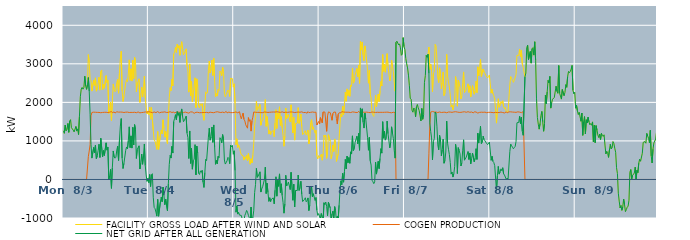
| Category | FACILITY GROSS LOAD AFTER WIND AND SOLAR | COGEN PRODUCTION | NET GRID AFTER ALL GENERATION |
|---|---|---|---|
|  Mon  8/3 | 1263 | 0 | 1263 |
|  Mon  8/3 | 1198 | 0 | 1198 |
|  Mon  8/3 | 1409 | 0 | 1409 |
|  Mon  8/3 | 1263 | 0 | 1263 |
|  Mon  8/3 | 1294 | 0 | 1294 |
|  Mon  8/3 | 1453 | 0 | 1453 |
|  Mon  8/3 | 1223 | 0 | 1223 |
|  Mon  8/3 | 1514 | 0 | 1514 |
|  Mon  8/3 | 1551 | 0 | 1551 |
|  Mon  8/3 | 1341 | 0 | 1341 |
|  Mon  8/3 | 1343 | 0 | 1343 |
|  Mon  8/3 | 1281 | 0 | 1281 |
|  Mon  8/3 | 1233 | 0 | 1233 |
|  Mon  8/3 | 1221 | 0 | 1221 |
|  Mon  8/3 | 1374 | 0 | 1374 |
|  Mon  8/3 | 1255 | 0 | 1255 |
|  Mon  8/3 | 1313 | 0 | 1313 |
|  Mon  8/3 | 1165 | 0 | 1165 |
|  Mon  8/3 | 1635 | 0 | 1635 |
|  Mon  8/3 | 2145 | 0 | 2145 |
|  Mon  8/3 | 2344 | 0 | 2344 |
|  Mon  8/3 | 2387 | 0 | 2387 |
|  Mon  8/3 | 2342 | 0 | 2342 |
|  Mon  8/3 | 2389 | 0 | 2389 |
|  Mon  8/3 | 2678 | 0 | 2678 |
|  Mon  8/3 | 2427 | 0 | 2427 |
|  Mon  8/3 | 2337 | 0 | 2337 |
|  Mon  8/3 | 2453 | 0 | 2453 |
|  Mon  8/3 | 3239 | 594 | 2645 |
|  Mon  8/3 | 3032 | 739 | 2293 |
|  Mon  8/3 | 2593 | 903 | 1690 |
|  Mon  8/3 | 2563 | 1652 | 911 |
|  Mon  8/3 | 2292 | 1738 | 554 |
|  Mon  8/3 | 2301 | 1746 | 555 |
|  Mon  8/3 | 2576 | 1746 | 830 |
|  Mon  8/3 | 2442 | 1756 | 686 |
|  Mon  8/3 | 2636 | 1743 | 893 |
|  Mon  8/3 | 2290 | 1748 | 542 |
|  Mon  8/3 | 2350 | 1740 | 610 |
|  Mon  8/3 | 2495 | 1747 | 748 |
|  Mon  8/3 | 2653 | 1739 | 914 |
|  Mon  8/3 | 2318 | 1748 | 570 |
|  Mon  8/3 | 2799 | 1731 | 1068 |
|  Mon  8/3 | 2841 | 1750 | 1091 |
|  Mon  8/3 | 2325 | 1739 | 586 |
|  Mon  8/3 | 2474 | 1723 | 751 |
|  Mon  8/3 | 2363 | 1742 | 621 |
|  Mon  8/3 | 2384 | 1741 | 643 |
|  Mon  8/3 | 2693 | 1743 | 950 |
|  Mon  8/3 | 2514 | 1754 | 760 |
|  Mon  8/3 | 2571 | 1736 | 835 |
|  Mon  8/3 | 1715 | 1728 | -13 |
|  Mon  8/3 | 1835 | 1745 | 90 |
|  Mon  8/3 | 2007 | 1746 | 261 |
|  Mon  8/3 | 1531 | 1762 | -231 |
|  Mon  8/3 | 2036 | 1731 | 305 |
|  Mon  8/3 | 2477 | 1738 | 739 |
|  Mon  8/3 | 2335 | 1753 | 582 |
|  Mon  8/3 | 2274 | 1723 | 551 |
|  Mon  8/3 | 2306 | 1729 | 577 |
|  Mon  8/3 | 2518 | 1756 | 762 |
|  Mon  8/3 | 2594 | 1731 | 863 |
|  Mon  8/3 | 2238 | 1746 | 492 |
|  Mon  8/3 | 2768 | 1747 | 1021 |
|  Mon  8/3 | 3132 | 1748 | 1384 |
|  Mon  8/3 | 3326 | 1747 | 1579 |
|  Mon  8/3 | 2298 | 1746 | 552 |
|  Mon  8/3 | 2024 | 1740 | 284 |
|  Mon  8/3 | 2154 | 1737 | 417 |
|  Mon  8/3 | 2334 | 1752 | 582 |
|  Mon  8/3 | 2500 | 1745 | 755 |
|  Mon  8/3 | 2589 | 1746 | 843 |
|  Mon  8/3 | 2538 | 1747 | 791 |
|  Mon  8/3 | 2739 | 1726 | 1013 |
|  Mon  8/3 | 3102 | 1737 | 1365 |
|  Mon  8/3 | 2573 | 1747 | 826 |
|  Mon  8/3 | 2870 | 1740 | 1130 |
|  Mon  8/3 | 2553 | 1739 | 814 |
|  Mon  8/3 | 3091 | 1739 | 1352 |
|  Mon  8/3 | 2617 | 1722 | 895 |
|  Mon  8/3 | 3167 | 1743 | 1424 |
|  Mon  8/3 | 3061 | 1753 | 1308 |
|  Mon  8/3 | 2277 | 1732 | 545 |
|  Mon  8/3 | 2511 | 1731 | 780 |
|  Mon  8/3 | 2545 | 1751 | 794 |
|  Mon  8/3 | 2611 | 1738 | 873 |
|  Mon  8/3 | 2000 | 1728 | 272 |
|  Mon  8/3 | 2168 | 1745 | 423 |
|  Mon  8/3 | 2396 | 1736 | 660 |
|  Mon  8/3 | 2139 | 1745 | 394 |
|  Mon  8/3 | 2350 | 1741 | 609 |
|  Mon  8/3 | 2678 | 1758 | 920 |
|  Mon  8/3 | 2111 | 1751 | 360 |
|  Mon  8/3 | 1874 | 1757 | 117 |
|  Mon  8/3 | 1698 | 1747 | -49 |
|  Mon  8/3 | 1777 | 1750 | 27 |
|  Tue  8/4 | 1676 | 1758 | -82 |
|  Tue  8/4 | 1878 | 1749 | 129 |
|  Tue  8/4 | 1564 | 1747 | -183 |
|  Tue  8/4 | 1865 | 1743 | 122 |
|  Tue  8/4 | 1880 | 1731 | 149 |
|  Tue  8/4 | 1274 | 1735 | -461 |
|  Tue  8/4 | 1027 | 1752 | -725 |
|  Tue  8/4 | 991 | 1749 | -758 |
|  Tue  8/4 | 889 | 1735 | -846 |
|  Tue  8/4 | 781 | 1732 | -951 |
|  Tue  8/4 | 1243 | 1759 | -516 |
|  Tue  8/4 | 781 | 1735 | -954 |
|  Tue  8/4 | 800 | 1730 | -930 |
|  Tue  8/4 | 1154 | 1740 | -586 |
|  Tue  8/4 | 1284 | 1744 | -460 |
|  Tue  8/4 | 1183 | 1761 | -578 |
|  Tue  8/4 | 1548 | 1746 | -198 |
|  Tue  8/4 | 1328 | 1745 | -417 |
|  Tue  8/4 | 1096 | 1753 | -657 |
|  Tue  8/4 | 1245 | 1755 | -510 |
|  Tue  8/4 | 1249 | 1737 | -488 |
|  Tue  8/4 | 926 | 1739 | -813 |
|  Tue  8/4 | 1633 | 1742 | -109 |
|  Tue  8/4 | 2122 | 1731 | 391 |
|  Tue  8/4 | 2380 | 1757 | 623 |
|  Tue  8/4 | 2306 | 1751 | 555 |
|  Tue  8/4 | 2595 | 1737 | 858 |
|  Tue  8/4 | 2428 | 1743 | 685 |
|  Tue  8/4 | 3254 | 1751 | 1503 |
|  Tue  8/4 | 3308 | 1724 | 1584 |
|  Tue  8/4 | 3426 | 1746 | 1680 |
|  Tue  8/4 | 3296 | 1747 | 1549 |
|  Tue  8/4 | 3509 | 1750 | 1759 |
|  Tue  8/4 | 3411 | 1748 | 1663 |
|  Tue  8/4 | 3474 | 1739 | 1735 |
|  Tue  8/4 | 3222 | 1741 | 1481 |
|  Tue  8/4 | 3458 | 1739 | 1719 |
|  Tue  8/4 | 3574 | 1744 | 1830 |
|  Tue  8/4 | 3372 | 1746 | 1626 |
|  Tue  8/4 | 3233 | 1735 | 1498 |
|  Tue  8/4 | 3279 | 1750 | 1529 |
|  Tue  8/4 | 3267 | 1748 | 1519 |
|  Tue  8/4 | 3388 | 1746 | 1642 |
|  Tue  8/4 | 2933 | 1733 | 1200 |
|  Tue  8/4 | 2805 | 1719 | 1086 |
|  Tue  8/4 | 2265 | 1721 | 544 |
|  Tue  8/4 | 2998 | 1740 | 1258 |
|  Tue  8/4 | 2169 | 1752 | 417 |
|  Tue  8/4 | 2551 | 1742 | 809 |
|  Tue  8/4 | 2017 | 1750 | 267 |
|  Tue  8/4 | 2238 | 1739 | 499 |
|  Tue  8/4 | 2242 | 1717 | 525 |
|  Tue  8/4 | 2638 | 1736 | 902 |
|  Tue  8/4 | 1862 | 1743 | 119 |
|  Tue  8/4 | 2610 | 1744 | 866 |
|  Tue  8/4 | 2425 | 1742 | 683 |
|  Tue  8/4 | 1898 | 1743 | 155 |
|  Tue  8/4 | 1860 | 1731 | 129 |
|  Tue  8/4 | 1963 | 1739 | 224 |
|  Tue  8/4 | 1918 | 1733 | 185 |
|  Tue  8/4 | 1967 | 1731 | 236 |
|  Tue  8/4 | 1665 | 1736 | -71 |
|  Tue  8/4 | 1535 | 1742 | -207 |
|  Tue  8/4 | 1915 | 1737 | 178 |
|  Tue  8/4 | 2274 | 1751 | 523 |
|  Tue  8/4 | 2228 | 1740 | 488 |
|  Tue  8/4 | 2254 | 1741 | 513 |
|  Tue  8/4 | 2828 | 1730 | 1098 |
|  Tue  8/4 | 3073 | 1744 | 1329 |
|  Tue  8/4 | 2764 | 1745 | 1019 |
|  Tue  8/4 | 2857 | 1755 | 1102 |
|  Tue  8/4 | 3098 | 1737 | 1361 |
|  Tue  8/4 | 2698 | 1735 | 963 |
|  Tue  8/4 | 3146 | 1732 | 1414 |
|  Tue  8/4 | 2578 | 1734 | 844 |
|  Tue  8/4 | 2140 | 1747 | 393 |
|  Tue  8/4 | 2228 | 1734 | 494 |
|  Tue  8/4 | 2163 | 1756 | 407 |
|  Tue  8/4 | 2334 | 1731 | 603 |
|  Tue  8/4 | 2308 | 1745 | 563 |
|  Tue  8/4 | 2812 | 1729 | 1083 |
|  Tue  8/4 | 2778 | 1737 | 1041 |
|  Tue  8/4 | 2688 | 1741 | 947 |
|  Tue  8/4 | 2910 | 1746 | 1164 |
|  Tue  8/4 | 2805 | 1751 | 1054 |
|  Tue  8/4 | 2238 | 1734 | 504 |
|  Tue  8/4 | 2142 | 1743 | 399 |
|  Tue  8/4 | 2201 | 1764 | 437 |
|  Tue  8/4 | 2213 | 1727 | 486 |
|  Tue  8/4 | 2319 | 1747 | 572 |
|  Tue  8/4 | 2291 | 1746 | 545 |
|  Tue  8/4 | 2153 | 1743 | 410 |
|  Tue  8/4 | 2624 | 1734 | 890 |
|  Tue  8/4 | 2601 | 1755 | 846 |
|  Tue  8/4 | 2617 | 1733 | 884 |
|  Tue  8/4 | 2396 | 1741 | 655 |
|  Wed  8/5 | 2481 | 1738 | 743 |
|  Wed  8/5 | 1969 | 1737 | 232 |
|  Wed  8/5 | 902 | 1752 | -850 |
|  Wed  8/5 | 1055 | 1746 | -691 |
|  Wed  8/5 | 830 | 1729 | -899 |
|  Wed  8/5 | 898 | 1750 | -852 |
|  Wed  8/5 | 832 | 1757 | -925 |
|  Wed  8/5 | 718 | 1654 | -936 |
|  Wed  8/5 | 639 | 1572 | -933 |
|  Wed  8/5 | 625 | 1646 | -1021 |
|  Wed  8/5 | 619 | 1720 | -1101 |
|  Wed  8/5 | 502 | 1561 | -1059 |
|  Wed  8/5 | 587 | 1518 | -931 |
|  Wed  8/5 | 543 | 1418 | -875 |
|  Wed  8/5 | 626 | 1429 | -803 |
|  Wed  8/5 | 480 | 1330 | -850 |
|  Wed  8/5 | 675 | 1605 | -930 |
|  Wed  8/5 | 515 | 1510 | -995 |
|  Wed  8/5 | 395 | 1549 | -1154 |
|  Wed  8/5 | 538 | 1254 | -716 |
|  Wed  8/5 | 428 | 1521 | -1093 |
|  Wed  8/5 | 627 | 1614 | -987 |
|  Wed  8/5 | 937 | 1751 | -814 |
|  Wed  8/5 | 1402 | 1742 | -340 |
|  Wed  8/5 | 1607 | 1742 | -135 |
|  Wed  8/5 | 2032 | 1746 | 286 |
|  Wed  8/5 | 1794 | 1740 | 54 |
|  Wed  8/5 | 1837 | 1748 | 89 |
|  Wed  8/5 | 1814 | 1741 | 73 |
|  Wed  8/5 | 1949 | 1751 | 198 |
|  Wed  8/5 | 1406 | 1733 | -327 |
|  Wed  8/5 | 1505 | 1746 | -241 |
|  Wed  8/5 | 1544 | 1734 | -190 |
|  Wed  8/5 | 1559 | 1744 | -185 |
|  Wed  8/5 | 1750 | 1750 | 0 |
|  Wed  8/5 | 2072 | 1753 | 319 |
|  Wed  8/5 | 1379 | 1745 | -366 |
|  Wed  8/5 | 1632 | 1728 | -96 |
|  Wed  8/5 | 1401 | 1739 | -338 |
|  Wed  8/5 | 1177 | 1746 | -569 |
|  Wed  8/5 | 1269 | 1743 | -474 |
|  Wed  8/5 | 1168 | 1743 | -575 |
|  Wed  8/5 | 1238 | 1747 | -509 |
|  Wed  8/5 | 1218 | 1728 | -510 |
|  Wed  8/5 | 1272 | 1750 | -478 |
|  Wed  8/5 | 1112 | 1745 | -633 |
|  Wed  8/5 | 1470 | 1748 | -278 |
|  Wed  8/5 | 1811 | 1742 | 69 |
|  Wed  8/5 | 1322 | 1756 | -434 |
|  Wed  8/5 | 1722 | 1743 | -21 |
|  Wed  8/5 | 1569 | 1748 | -179 |
|  Wed  8/5 | 1883 | 1739 | 144 |
|  Wed  8/5 | 1400 | 1740 | -340 |
|  Wed  8/5 | 1630 | 1743 | -113 |
|  Wed  8/5 | 1338 | 1754 | -416 |
|  Wed  8/5 | 1140 | 1743 | -603 |
|  Wed  8/5 | 862 | 1737 | -875 |
|  Wed  8/5 | 1125 | 1761 | -636 |
|  Wed  8/5 | 1853 | 1745 | 108 |
|  Wed  8/5 | 1580 | 1751 | -171 |
|  Wed  8/5 | 1605 | 1741 | -136 |
|  Wed  8/5 | 1686 | 1753 | -67 |
|  Wed  8/5 | 1662 | 1748 | -86 |
|  Wed  8/5 | 1493 | 1756 | -263 |
|  Wed  8/5 | 1936 | 1751 | 185 |
|  Wed  8/5 | 1924 | 1735 | 189 |
|  Wed  8/5 | 1208 | 1747 | -539 |
|  Wed  8/5 | 1616 | 1739 | -123 |
|  Wed  8/5 | 1021 | 1736 | -715 |
|  Wed  8/5 | 1445 | 1730 | -285 |
|  Wed  8/5 | 1443 | 1742 | -299 |
|  Wed  8/5 | 1462 | 1751 | -289 |
|  Wed  8/5 | 1863 | 1749 | 114 |
|  Wed  8/5 | 1455 | 1739 | -284 |
|  Wed  8/5 | 1533 | 1744 | -211 |
|  Wed  8/5 | 1697 | 1743 | -46 |
|  Wed  8/5 | 1375 | 1754 | -379 |
|  Wed  8/5 | 1163 | 1737 | -574 |
|  Wed  8/5 | 1184 | 1735 | -551 |
|  Wed  8/5 | 1217 | 1737 | -520 |
|  Wed  8/5 | 1264 | 1739 | -475 |
|  Wed  8/5 | 1151 | 1730 | -579 |
|  Wed  8/5 | 1174 | 1720 | -546 |
|  Wed  8/5 | 1281 | 1760 | -479 |
|  Wed  8/5 | 927 | 1734 | -807 |
|  Wed  8/5 | 1072 | 1739 | -667 |
|  Wed  8/5 | 1476 | 1741 | -265 |
|  Wed  8/5 | 1552 | 1742 | -190 |
|  Wed  8/5 | 1298 | 1750 | -452 |
|  Wed  8/5 | 1364 | 1733 | -369 |
|  Wed  8/5 | 1378 | 1742 | -364 |
|  Wed  8/5 | 1199 | 1746 | -547 |
|  Wed  8/5 | 1276 | 1744 | -468 |
|  Wed  8/5 | 616 | 1413 | -797 |
|  Wed  8/5 | 532 | 1464 | -932 |
|  Wed  8/5 | 620 | 1505 | -885 |
|  Thu  8/6 | 563 | 1438 | -875 |
|  Thu  8/6 | 574 | 1604 | -1030 |
|  Thu  8/6 | 654 | 1539 | -885 |
|  Thu  8/6 | 499 | 1468 | -969 |
|  Thu  8/6 | 661 | 1751 | -1090 |
|  Thu  8/6 | 1148 | 1753 | -605 |
|  Thu  8/6 | 1098 | 1749 | -651 |
|  Thu  8/6 | 1150 | 1735 | -585 |
|  Thu  8/6 | 550 | 1249 | -699 |
|  Thu  8/6 | 708 | 1651 | -943 |
|  Thu  8/6 | 1161 | 1752 | -591 |
|  Thu  8/6 | 1155 | 1742 | -587 |
|  Thu  8/6 | 994 | 1734 | -740 |
|  Thu  8/6 | 538 | 1647 | -1109 |
|  Thu  8/6 | 639 | 1536 | -897 |
|  Thu  8/6 | 890 | 1711 | -821 |
|  Thu  8/6 | 725 | 1746 | -1021 |
|  Thu  8/6 | 1050 | 1755 | -705 |
|  Thu  8/6 | 940 | 1748 | -808 |
|  Thu  8/6 | 469 | 1583 | -1114 |
|  Thu  8/6 | 488 | 1438 | -950 |
|  Thu  8/6 | 665 | 1691 | -1026 |
|  Thu  8/6 | 1060 | 1729 | -669 |
|  Thu  8/6 | 1443 | 1729 | -286 |
|  Thu  8/6 | 1693 | 1728 | -35 |
|  Thu  8/6 | 1625 | 1759 | -134 |
|  Thu  8/6 | 1896 | 1738 | 158 |
|  Thu  8/6 | 1678 | 1749 | -71 |
|  Thu  8/6 | 1939 | 1741 | 198 |
|  Thu  8/6 | 2266 | 1745 | 521 |
|  Thu  8/6 | 2029 | 1756 | 273 |
|  Thu  8/6 | 2349 | 1744 | 605 |
|  Thu  8/6 | 2177 | 1743 | 434 |
|  Thu  8/6 | 2312 | 1744 | 568 |
|  Thu  8/6 | 2157 | 1737 | 420 |
|  Thu  8/6 | 2452 | 1736 | 716 |
|  Thu  8/6 | 2412 | 1753 | 659 |
|  Thu  8/6 | 2883 | 1752 | 1131 |
|  Thu  8/6 | 2497 | 1750 | 747 |
|  Thu  8/6 | 2532 | 1747 | 785 |
|  Thu  8/6 | 2705 | 1743 | 962 |
|  Thu  8/6 | 2716 | 1738 | 978 |
|  Thu  8/6 | 2879 | 1757 | 1122 |
|  Thu  8/6 | 2665 | 1739 | 926 |
|  Thu  8/6 | 2964 | 1768 | 1196 |
|  Thu  8/6 | 2493 | 1736 | 757 |
|  Thu  8/6 | 3583 | 1728 | 1855 |
|  Thu  8/6 | 3356 | 1739 | 1617 |
|  Thu  8/6 | 3567 | 1734 | 1833 |
|  Thu  8/6 | 3230 | 1745 | 1485 |
|  Thu  8/6 | 3081 | 1748 | 1333 |
|  Thu  8/6 | 3465 | 1743 | 1722 |
|  Thu  8/6 | 3318 | 1752 | 1566 |
|  Thu  8/6 | 3332 | 1747 | 1585 |
|  Thu  8/6 | 2832 | 1739 | 1093 |
|  Thu  8/6 | 2497 | 1739 | 758 |
|  Thu  8/6 | 2835 | 1744 | 1091 |
|  Thu  8/6 | 2219 | 1734 | 485 |
|  Thu  8/6 | 2109 | 1736 | 373 |
|  Thu  8/6 | 1731 | 1750 | -19 |
|  Thu  8/6 | 1675 | 1734 | -59 |
|  Thu  8/6 | 1635 | 1744 | -109 |
|  Thu  8/6 | 1660 | 1722 | -62 |
|  Thu  8/6 | 2189 | 1738 | 451 |
|  Thu  8/6 | 1880 | 1741 | 139 |
|  Thu  8/6 | 1867 | 1743 | 124 |
|  Thu  8/6 | 2211 | 1742 | 469 |
|  Thu  8/6 | 2021 | 1740 | 281 |
|  Thu  8/6 | 2295 | 1750 | 545 |
|  Thu  8/6 | 2542 | 1742 | 800 |
|  Thu  8/6 | 2424 | 1741 | 683 |
|  Thu  8/6 | 3239 | 1741 | 1498 |
|  Thu  8/6 | 2807 | 1736 | 1071 |
|  Thu  8/6 | 2990 | 1743 | 1247 |
|  Thu  8/6 | 2782 | 1762 | 1020 |
|  Thu  8/6 | 2805 | 1745 | 1060 |
|  Thu  8/6 | 3263 | 1749 | 1514 |
|  Thu  8/6 | 2933 | 1746 | 1187 |
|  Thu  8/6 | 2954 | 1748 | 1206 |
|  Thu  8/6 | 2554 | 1735 | 819 |
|  Thu  8/6 | 2702 | 1740 | 962 |
|  Thu  8/6 | 3096 | 1730 | 1366 |
|  Thu  8/6 | 2939 | 1734 | 1205 |
|  Thu  8/6 | 2804 | 1743 | 1061 |
|  Thu  8/6 | 2507 | 1754 | 753 |
|  Thu  8/6 | 2290 | 1737 | 553 |
|  Thu  8/6 | 3559 | 0 | 3559 |
|  Thu  8/6 | 3587 | 0 | 3587 |
|  Thu  8/6 | 3598 | 0 | 3598 |
|  Thu  8/6 | 3489 | 0 | 3489 |
|  Thu  8/6 | 3517 | 0 | 3517 |
|  Thu  8/6 | 3413 | 0 | 3413 |
|  Thu  8/6 | 3222 | 0 | 3222 |
|  Thu  8/6 | 3251 | 0 | 3251 |
|  Thu  8/6 | 3679 | 0 | 3679 |
|  Thu  8/6 | 3446 | 0 | 3446 |
|  Fri  8/7 | 3369 | 0 | 3369 |
|  Fri  8/7 | 3139 | 0 | 3139 |
|  Fri  8/7 | 3000 | 0 | 3000 |
|  Fri  8/7 | 2893 | 0 | 2893 |
|  Fri  8/7 | 2707 | 0 | 2707 |
|  Fri  8/7 | 2446 | 0 | 2446 |
|  Fri  8/7 | 2107 | 0 | 2107 |
|  Fri  8/7 | 2081 | 0 | 2081 |
|  Fri  8/7 | 1796 | 0 | 1796 |
|  Fri  8/7 | 1745 | 0 | 1745 |
|  Fri  8/7 | 1854 | 0 | 1854 |
|  Fri  8/7 | 1819 | 0 | 1819 |
|  Fri  8/7 | 1627 | 0 | 1627 |
|  Fri  8/7 | 1882 | 0 | 1882 |
|  Fri  8/7 | 1946 | 0 | 1946 |
|  Fri  8/7 | 1856 | 0 | 1856 |
|  Fri  8/7 | 1791 | 0 | 1791 |
|  Fri  8/7 | 1668 | 0 | 1668 |
|  Fri  8/7 | 1518 | 0 | 1518 |
|  Fri  8/7 | 1841 | 0 | 1841 |
|  Fri  8/7 | 1561 | 0 | 1561 |
|  Fri  8/7 | 1683 | 0 | 1683 |
|  Fri  8/7 | 2520 | 0 | 2520 |
|  Fri  8/7 | 2698 | 0 | 2698 |
|  Fri  8/7 | 3218 | 0 | 3218 |
|  Fri  8/7 | 3169 | 0 | 3169 |
|  Fri  8/7 | 3250 | 0 | 3250 |
|  Fri  8/7 | 3434 | 681 | 2753 |
|  Fri  8/7 | 2855 | 1389 | 1466 |
|  Fri  8/7 | 2995 | 1747 | 1248 |
|  Fri  8/7 | 2815 | 1737 | 1078 |
|  Fri  8/7 | 2273 | 1764 | 509 |
|  Fri  8/7 | 2739 | 1759 | 980 |
|  Fri  8/7 | 2808 | 1750 | 1058 |
|  Fri  8/7 | 3502 | 1752 | 1750 |
|  Fri  8/7 | 3455 | 1749 | 1706 |
|  Fri  8/7 | 3137 | 1754 | 1383 |
|  Fri  8/7 | 2633 | 1737 | 896 |
|  Fri  8/7 | 2512 | 1744 | 768 |
|  Fri  8/7 | 2895 | 1750 | 1145 |
|  Fri  8/7 | 2765 | 1739 | 1026 |
|  Fri  8/7 | 2350 | 1738 | 612 |
|  Fri  8/7 | 2517 | 1746 | 771 |
|  Fri  8/7 | 2787 | 1743 | 1044 |
|  Fri  8/7 | 2177 | 1756 | 421 |
|  Fri  8/7 | 2234 | 1745 | 489 |
|  Fri  8/7 | 2458 | 1746 | 712 |
|  Fri  8/7 | 3245 | 1731 | 1514 |
|  Fri  8/7 | 2676 | 1739 | 937 |
|  Fri  8/7 | 2533 | 1749 | 784 |
|  Fri  8/7 | 2394 | 1750 | 644 |
|  Fri  8/7 | 2190 | 1748 | 442 |
|  Fri  8/7 | 1879 | 1740 | 139 |
|  Fri  8/7 | 1935 | 1741 | 194 |
|  Fri  8/7 | 1803 | 1741 | 62 |
|  Fri  8/7 | 1904 | 1752 | 152 |
|  Fri  8/7 | 2082 | 1744 | 338 |
|  Fri  8/7 | 2669 | 1757 | 912 |
|  Fri  8/7 | 2486 | 1746 | 740 |
|  Fri  8/7 | 1901 | 1748 | 153 |
|  Fri  8/7 | 2578 | 1753 | 825 |
|  Fri  8/7 | 2496 | 1741 | 755 |
|  Fri  8/7 | 2387 | 1725 | 662 |
|  Fri  8/7 | 2090 | 1741 | 349 |
|  Fri  8/7 | 2160 | 1729 | 431 |
|  Fri  8/7 | 2509 | 1750 | 759 |
|  Fri  8/7 | 2789 | 1760 | 1029 |
|  Fri  8/7 | 2256 | 1756 | 500 |
|  Fri  8/7 | 2234 | 1745 | 489 |
|  Fri  8/7 | 2324 | 1743 | 581 |
|  Fri  8/7 | 2319 | 1750 | 569 |
|  Fri  8/7 | 2481 | 1757 | 724 |
|  Fri  8/7 | 2259 | 1740 | 519 |
|  Fri  8/7 | 2429 | 1742 | 687 |
|  Fri  8/7 | 2141 | 1737 | 404 |
|  Fri  8/7 | 2291 | 1750 | 541 |
|  Fri  8/7 | 2435 | 1750 | 685 |
|  Fri  8/7 | 2427 | 1727 | 700 |
|  Fri  8/7 | 2212 | 1754 | 458 |
|  Fri  8/7 | 2293 | 1741 | 552 |
|  Fri  8/7 | 2548 | 1750 | 798 |
|  Fri  8/7 | 2252 | 1732 | 520 |
|  Fri  8/7 | 2922 | 1722 | 1200 |
|  Fri  8/7 | 2684 | 1741 | 943 |
|  Fri  8/7 | 2918 | 1740 | 1178 |
|  Fri  8/7 | 3123 | 1741 | 1382 |
|  Fri  8/7 | 2672 | 1745 | 927 |
|  Fri  8/7 | 2691 | 1738 | 953 |
|  Fri  8/7 | 2866 | 1742 | 1124 |
|  Fri  8/7 | 2785 | 1751 | 1034 |
|  Fri  8/7 | 2749 | 1746 | 1003 |
|  Fri  8/7 | 2755 | 1749 | 1006 |
|  Fri  8/7 | 2661 | 1731 | 930 |
|  Fri  8/7 | 2634 | 1731 | 903 |
|  Fri  8/7 | 2665 | 1741 | 924 |
|  Fri  8/7 | 2710 | 1739 | 971 |
|  Sat  8/8 | 2694 | 1742 | 952 |
|  Sat  8/8 | 2240 | 1743 | 497 |
|  Sat  8/8 | 2338 | 1738 | 600 |
|  Sat  8/8 | 2225 | 1757 | 468 |
|  Sat  8/8 | 2170 | 1731 | 439 |
|  Sat  8/8 | 2094 | 1735 | 359 |
|  Sat  8/8 | 2092 | 1741 | 351 |
|  Sat  8/8 | 1461 | 1750 | -289 |
|  Sat  8/8 | 1828 | 1735 | 93 |
|  Sat  8/8 | 2094 | 1756 | 338 |
|  Sat  8/8 | 1874 | 1736 | 138 |
|  Sat  8/8 | 1928 | 1733 | 195 |
|  Sat  8/8 | 2023 | 1748 | 275 |
|  Sat  8/8 | 1973 | 1747 | 226 |
|  Sat  8/8 | 2041 | 1736 | 305 |
|  Sat  8/8 | 1886 | 1741 | 145 |
|  Sat  8/8 | 1840 | 1726 | 114 |
|  Sat  8/8 | 1870 | 1738 | 132 |
|  Sat  8/8 | 1757 | 1753 | 4 |
|  Sat  8/8 | 1763 | 1727 | 36 |
|  Sat  8/8 | 1754 | 1749 | 5 |
|  Sat  8/8 | 1762 | 1753 | 9 |
|  Sat  8/8 | 2470 | 1745 | 725 |
|  Sat  8/8 | 2672 | 1754 | 918 |
|  Sat  8/8 | 2623 | 1751 | 872 |
|  Sat  8/8 | 2584 | 1748 | 836 |
|  Sat  8/8 | 2519 | 1723 | 796 |
|  Sat  8/8 | 2570 | 1745 | 825 |
|  Sat  8/8 | 2594 | 1738 | 856 |
|  Sat  8/8 | 2728 | 1741 | 987 |
|  Sat  8/8 | 3219 | 1748 | 1471 |
|  Sat  8/8 | 3217 | 1754 | 1463 |
|  Sat  8/8 | 3214 | 1736 | 1478 |
|  Sat  8/8 | 3385 | 1747 | 1638 |
|  Sat  8/8 | 3184 | 1736 | 1448 |
|  Sat  8/8 | 3350 | 1733 | 1617 |
|  Sat  8/8 | 2999 | 1748 | 1251 |
|  Sat  8/8 | 2906 | 1760 | 1146 |
|  Sat  8/8 | 2890 | 1746 | 1144 |
|  Sat  8/8 | 2662 | 0 | 2662 |
|  Sat  8/8 | 2761 | 0 | 2761 |
|  Sat  8/8 | 3416 | 0 | 3416 |
|  Sat  8/8 | 3483 | 0 | 3483 |
|  Sat  8/8 | 3109 | 0 | 3109 |
|  Sat  8/8 | 3090 | 0 | 3090 |
|  Sat  8/8 | 3320 | 0 | 3320 |
|  Sat  8/8 | 3018 | 0 | 3018 |
|  Sat  8/8 | 3390 | 0 | 3390 |
|  Sat  8/8 | 3419 | 0 | 3419 |
|  Sat  8/8 | 3226 | 0 | 3226 |
|  Sat  8/8 | 3572 | 0 | 3572 |
|  Sat  8/8 | 3095 | 0 | 3095 |
|  Sat  8/8 | 2090 | 0 | 2090 |
|  Sat  8/8 | 1610 | 0 | 1610 |
|  Sat  8/8 | 1435 | 0 | 1435 |
|  Sat  8/8 | 1305 | 0 | 1305 |
|  Sat  8/8 | 1452 | 0 | 1452 |
|  Sat  8/8 | 1659 | 0 | 1659 |
|  Sat  8/8 | 1764 | 0 | 1764 |
|  Sat  8/8 | 1498 | 0 | 1498 |
|  Sat  8/8 | 1250 | 0 | 1250 |
|  Sat  8/8 | 1447 | 0 | 1447 |
|  Sat  8/8 | 2184 | 0 | 2184 |
|  Sat  8/8 | 1960 | 0 | 1960 |
|  Sat  8/8 | 2269 | 0 | 2269 |
|  Sat  8/8 | 2569 | 0 | 2569 |
|  Sat  8/8 | 2506 | 0 | 2506 |
|  Sat  8/8 | 2672 | 0 | 2672 |
|  Sat  8/8 | 1851 | 0 | 1851 |
|  Sat  8/8 | 1987 | 0 | 1987 |
|  Sat  8/8 | 2080 | 0 | 2080 |
|  Sat  8/8 | 2098 | 0 | 2098 |
|  Sat  8/8 | 2126 | 0 | 2126 |
|  Sat  8/8 | 2138 | 0 | 2138 |
|  Sat  8/8 | 2419 | 0 | 2419 |
|  Sat  8/8 | 2286 | 0 | 2286 |
|  Sat  8/8 | 2236 | 0 | 2236 |
|  Sat  8/8 | 2954 | 0 | 2954 |
|  Sat  8/8 | 2234 | 0 | 2234 |
|  Sat  8/8 | 2254 | 0 | 2254 |
|  Sat  8/8 | 2085 | 0 | 2085 |
|  Sat  8/8 | 2333 | 0 | 2333 |
|  Sat  8/8 | 2352 | 0 | 2352 |
|  Sat  8/8 | 2173 | 0 | 2173 |
|  Sat  8/8 | 2261 | 0 | 2261 |
|  Sat  8/8 | 2460 | 0 | 2460 |
|  Sat  8/8 | 2392 | 0 | 2392 |
|  Sat  8/8 | 2669 | 0 | 2669 |
|  Sat  8/8 | 2803 | 0 | 2803 |
|  Sat  8/8 | 2768 | 0 | 2768 |
|  Sat  8/8 | 2804 | 0 | 2804 |
|  Sat  8/8 | 2864 | 0 | 2864 |
|  Sat  8/8 | 2958 | 0 | 2958 |
|  Sat  8/8 | 2312 | 0 | 2312 |
|  Sat  8/8 | 2220 | 0 | 2220 |
|  Sat  8/8 | 2262 | 0 | 2262 |
|  Sun  8/9 | 1849 | 0 | 1849 |
|  Sun  8/9 | 1924 | 0 | 1924 |
|  Sun  8/9 | 1782 | 0 | 1782 |
|  Sun  8/9 | 1683 | 0 | 1683 |
|  Sun  8/9 | 1745 | 0 | 1745 |
|  Sun  8/9 | 1723 | 0 | 1723 |
|  Sun  8/9 | 1510 | 0 | 1510 |
|  Sun  8/9 | 1723 | 0 | 1723 |
|  Sun  8/9 | 1145 | 0 | 1145 |
|  Sun  8/9 | 1505 | 0 | 1505 |
|  Sun  8/9 | 1631 | 0 | 1631 |
|  Sun  8/9 | 1179 | 0 | 1179 |
|  Sun  8/9 | 1550 | 0 | 1550 |
|  Sun  8/9 | 1464 | 0 | 1464 |
|  Sun  8/9 | 1616 | 0 | 1616 |
|  Sun  8/9 | 1493 | 0 | 1493 |
|  Sun  8/9 | 1419 | 0 | 1419 |
|  Sun  8/9 | 1451 | 0 | 1451 |
|  Sun  8/9 | 1406 | 0 | 1406 |
|  Sun  8/9 | 1493 | 0 | 1493 |
|  Sun  8/9 | 976 | 0 | 976 |
|  Sun  8/9 | 1407 | 0 | 1407 |
|  Sun  8/9 | 954 | 0 | 954 |
|  Sun  8/9 | 1397 | 0 | 1397 |
|  Sun  8/9 | 1282 | 0 | 1282 |
|  Sun  8/9 | 1153 | 0 | 1153 |
|  Sun  8/9 | 1086 | 0 | 1086 |
|  Sun  8/9 | 1179 | 0 | 1179 |
|  Sun  8/9 | 1036 | 0 | 1036 |
|  Sun  8/9 | 1196 | 0 | 1196 |
|  Sun  8/9 | 1145 | 0 | 1145 |
|  Sun  8/9 | 1117 | 0 | 1117 |
|  Sun  8/9 | 1158 | 0 | 1158 |
|  Sun  8/9 | 893 | 0 | 893 |
|  Sun  8/9 | 663 | 0 | 663 |
|  Sun  8/9 | 727 | 0 | 727 |
|  Sun  8/9 | 678 | 0 | 678 |
|  Sun  8/9 | 573 | 0 | 573 |
|  Sun  8/9 | 763 | 0 | 763 |
|  Sun  8/9 | 911 | 0 | 911 |
|  Sun  8/9 | 793 | 0 | 793 |
|  Sun  8/9 | 819 | 0 | 819 |
|  Sun  8/9 | 982 | 0 | 982 |
|  Sun  8/9 | 931 | 0 | 931 |
|  Sun  8/9 | 811 | 0 | 811 |
|  Sun  8/9 | 705 | 0 | 705 |
|  Sun  8/9 | 304 | 0 | 304 |
|  Sun  8/9 | 152 | 0 | 152 |
|  Sun  8/9 | -356 | 0 | -356 |
|  Sun  8/9 | -562 | 0 | -562 |
|  Sun  8/9 | -740 | 0 | -740 |
|  Sun  8/9 | -676 | 0 | -676 |
|  Sun  8/9 | -801 | 0 | -801 |
|  Sun  8/9 | -714 | 0 | -714 |
|  Sun  8/9 | -509 | 0 | -509 |
|  Sun  8/9 | -656 | 0 | -656 |
|  Sun  8/9 | -835 | 0 | -835 |
|  Sun  8/9 | -784 | 0 | -784 |
|  Sun  8/9 | -719 | 0 | -719 |
|  Sun  8/9 | -693 | 0 | -693 |
|  Sun  8/9 | -537 | 0 | -537 |
|  Sun  8/9 | 186 | 0 | 186 |
|  Sun  8/9 | 257 | 0 | 257 |
|  Sun  8/9 | 10 | 0 | 10 |
|  Sun  8/9 | 103 | 0 | 103 |
|  Sun  8/9 | 106 | 0 | 106 |
|  Sun  8/9 | 166 | 0 | 166 |
|  Sun  8/9 | 319 | 0 | 319 |
|  Sun  8/9 | 6 | 0 | 6 |
|  Sun  8/9 | 238 | 0 | 238 |
|  Sun  8/9 | 178 | 0 | 178 |
|  Sun  8/9 | 423 | 0 | 423 |
|  Sun  8/9 | 527 | 0 | 527 |
|  Sun  8/9 | 471 | 0 | 471 |
|  Sun  8/9 | 490 | 0 | 490 |
|  Sun  8/9 | 680 | 0 | 680 |
|  Sun  8/9 | 962 | 0 | 962 |
|  Sun  8/9 | 976 | 0 | 976 |
|  Sun  8/9 | 981 | 0 | 981 |
|  Sun  8/9 | 940 | 0 | 940 |
|  Sun  8/9 | 1194 | 0 | 1194 |
|  Sun  8/9 | 1125 | 0 | 1125 |
|  Sun  8/9 | 1071 | 0 | 1071 |
|  Sun  8/9 | 951 | 0 | 951 |
|  Sun  8/9 | 1274 | 0 | 1274 |
|  Sun  8/9 | 610 | 0 | 610 |
|  Sun  8/9 | 427 | 0 | 427 |
|  Sun  8/9 | 786 | 0 | 786 |
|  Sun  8/9 | 947 | 0 | 947 |
|  Sun  8/9 | 998 | 0 | 998 |
|  Sun  8/9 | 1048 | 0 | 1048 |
|  Sun  8/9 | 1233 | 0 | 1233 |